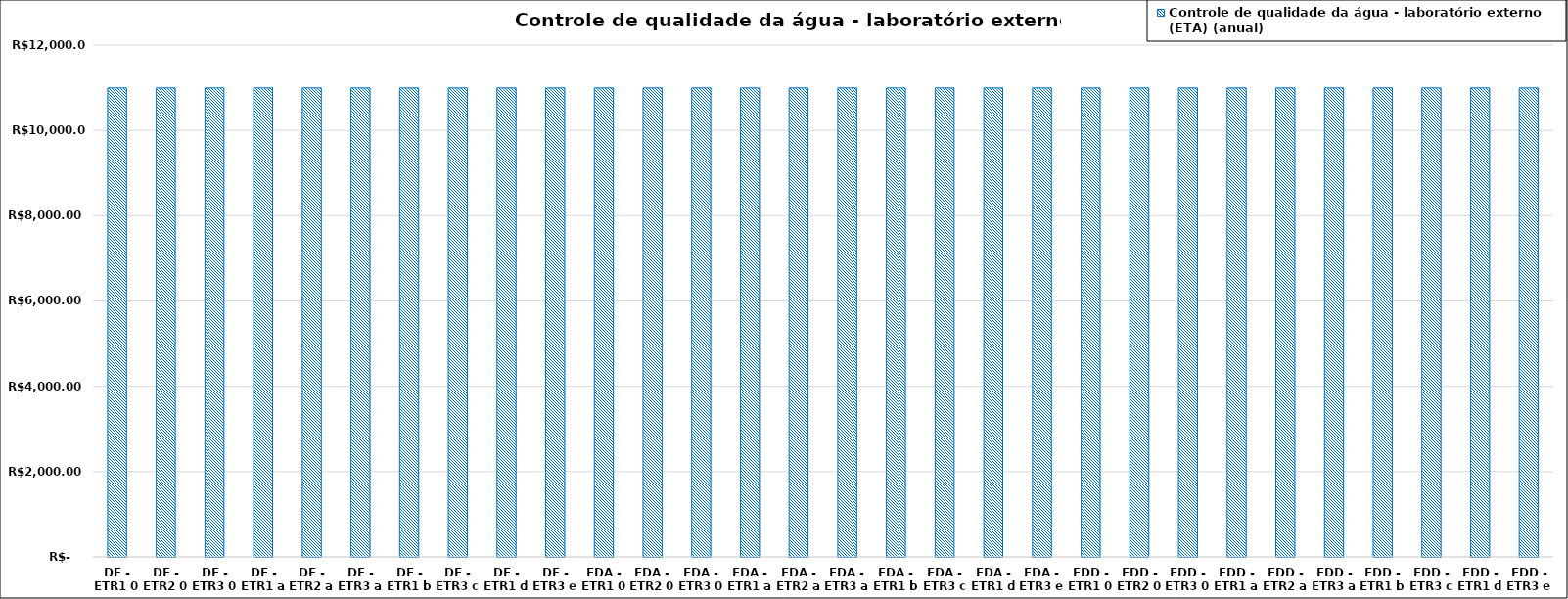
| Category | Controle de qualidade da água - laboratório externo (ETA) (anual) |
|---|---|
| DF - ETR1 0 | 10994.29 |
| DF - ETR2 0 | 10994.29 |
| DF - ETR3 0 | 10994.29 |
| DF - ETR1 a | 10994.29 |
| DF - ETR2 a | 10994.29 |
| DF - ETR3 a | 10994.29 |
| DF - ETR1 b | 10994.29 |
| DF - ETR3 c | 10994.29 |
| DF - ETR1 d | 10994.29 |
| DF - ETR3 e | 10994.29 |
| FDA - ETR1 0 | 10994.29 |
| FDA - ETR2 0 | 10994.29 |
| FDA - ETR3 0 | 10994.29 |
| FDA - ETR1 a | 10994.29 |
| FDA - ETR2 a | 10994.29 |
| FDA - ETR3 a | 10994.29 |
| FDA - ETR1 b | 10994.29 |
| FDA - ETR3 c | 10994.29 |
| FDA - ETR1 d | 10994.29 |
| FDA - ETR3 e | 10994.29 |
| FDD - ETR1 0 | 10994.29 |
| FDD - ETR2 0 | 10994.29 |
| FDD - ETR3 0 | 10994.29 |
| FDD - ETR1 a | 10994.29 |
| FDD - ETR2 a | 10994.29 |
| FDD - ETR3 a | 10994.29 |
| FDD - ETR1 b | 10994.29 |
| FDD - ETR3 c | 10994.29 |
| FDD - ETR1 d | 10994.29 |
| FDD - ETR3 e | 10994.29 |